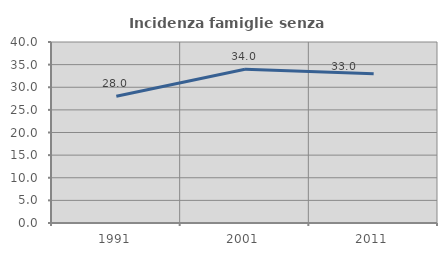
| Category | Incidenza famiglie senza nuclei |
|---|---|
| 1991.0 | 28 |
| 2001.0 | 33.984 |
| 2011.0 | 32.967 |